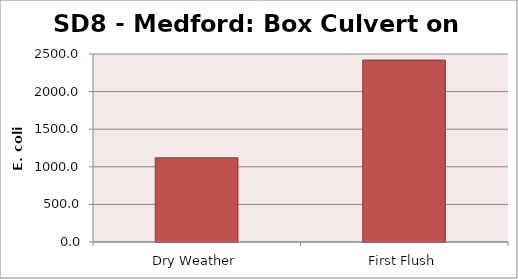
| Category | E. coli MPN |
|---|---|
| Dry Weather | 1119.9 |
| First Flush | 2419.2 |